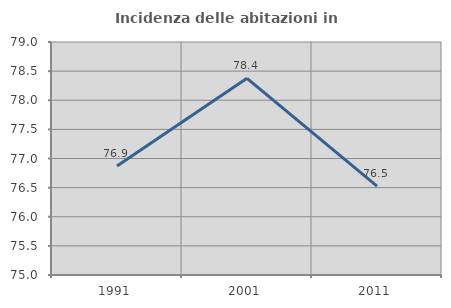
| Category | Incidenza delle abitazioni in proprietà  |
|---|---|
| 1991.0 | 76.871 |
| 2001.0 | 78.376 |
| 2011.0 | 76.527 |